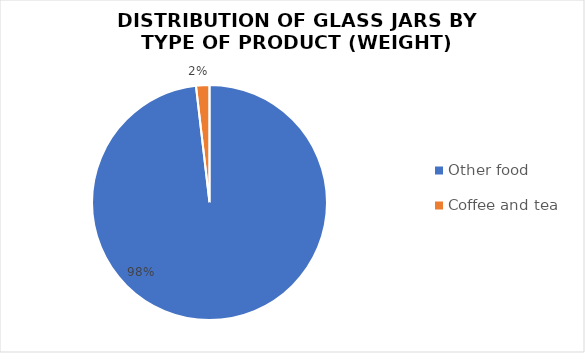
| Category | Series 0 |
|---|---|
| Other food | 179.27 |
| Coffee and tea | 3.36 |